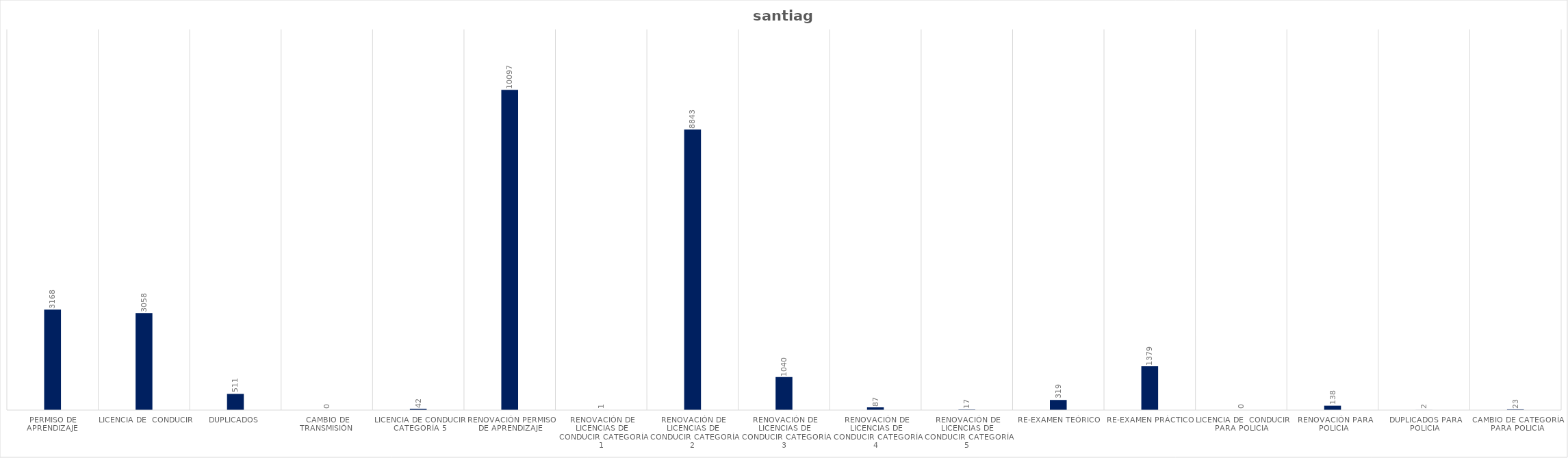
| Category | Series 0 |
|---|---|
| Permiso de Aprendizaje  | 3168 |
| Licencia de  Conducir  | 3058 |
| Duplicados  | 511 |
| Cambio de Transmisión  | 0 |
| Licencia de Conducir Categoría 5 | 42 |
| Renovación Permiso de Aprendizaje | 10097 |
| Renovación de Licencias de Conducir Categoría 1 | 1 |
| Renovación de Licencias de Conducir Categoría 2 | 8843 |
| Renovación de Licencias de Conducir Categoría 3 | 1040 |
| Renovación de Licencias de Conducir Categoría 4 | 87 |
| Renovación de Licencias de Conducir Categoría 5 | 17 |
| Re-Examen Teórico | 319 |
| Re-Examen Práctico | 1379 |
| Licencia de  Conducir para Policia  | 0 |
| Renovación para Policia | 138 |
| Duplicados para Policia | 2 |
| Cambio de Categoría para Policia | 23 |